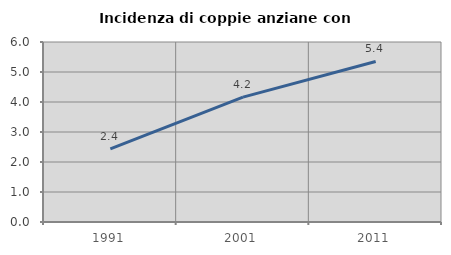
| Category | Incidenza di coppie anziane con figli |
|---|---|
| 1991.0 | 2.437 |
| 2001.0 | 4.163 |
| 2011.0 | 5.35 |